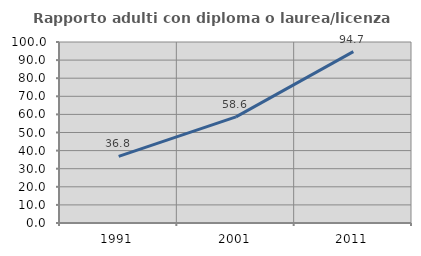
| Category | Rapporto adulti con diploma o laurea/licenza media  |
|---|---|
| 1991.0 | 36.842 |
| 2001.0 | 58.644 |
| 2011.0 | 94.65 |